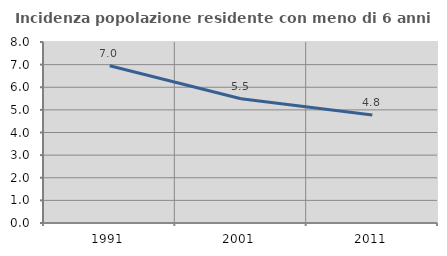
| Category | Incidenza popolazione residente con meno di 6 anni |
|---|---|
| 1991.0 | 6.95 |
| 2001.0 | 5.493 |
| 2011.0 | 4.778 |